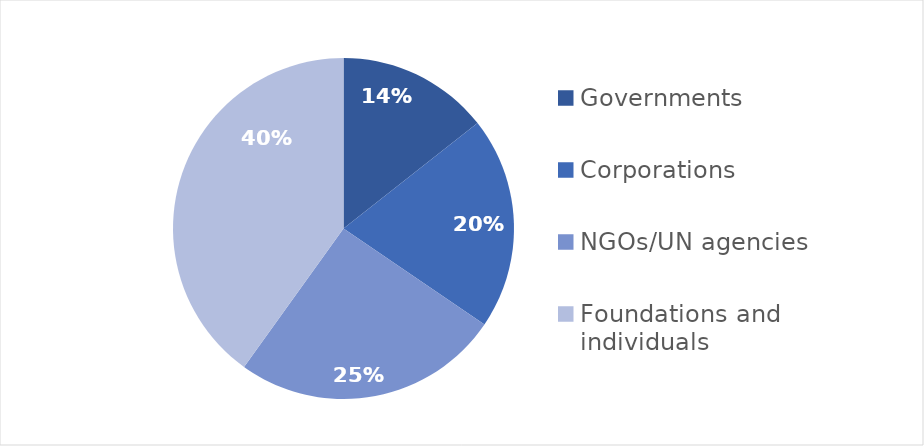
| Category | Series 0 |
|---|---|
| Governments | 0.144 |
| Corporations | 0.201 |
| NGOs/UN agencies | 0.254 |
| Foundations and individuals | 0.401 |